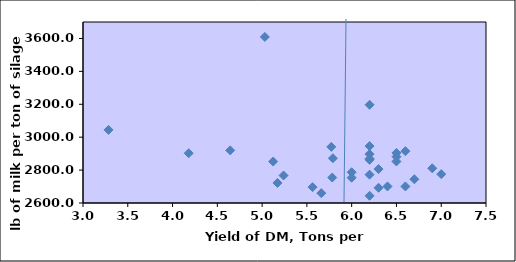
| Category | Series 0 |
|---|---|
| 6.3 | 2806 |
| 6.5 | 2852.5 |
| 6.0 | 2753.75 |
| 6.2 | 2869.25 |
| 6.5 | 2904.25 |
| 6.3 | 2692.5 |
| 5.23910527 | 2767.25 |
| 5.03051096 | 3609.3 |
| 5.56357973 | 2696.25 |
| 6.2 | 3197 |
| 5.78303071 | 2754.75 |
| 6.4 | 2700.5 |
| 6.2 | 2643.75 |
| 5.17180203 | 2722 |
| 5.79047622 | 2872 |
| 6.2 | 2862.5 |
| 6.2 | 2772.25 |
| 6.5 | 2881.5 |
| 6.9 | 2811 |
| 5.12381009 | 2852 |
| 4.64350223 | 2920 |
| 3.2854228 | 3044.333 |
| 4.18035854 | 2902.5 |
| 6.0 | 2787 |
| 5.7726136 | 2941 |
| 5.66100187 | 2659.75 |
| 6.7 | 2744.25 |
| 6.2 | 2897 |
| 6.6 | 2915 |
| 6.6 | 2700.75 |
| 6.2 | 2946 |
| 7.0 | 2775.333 |